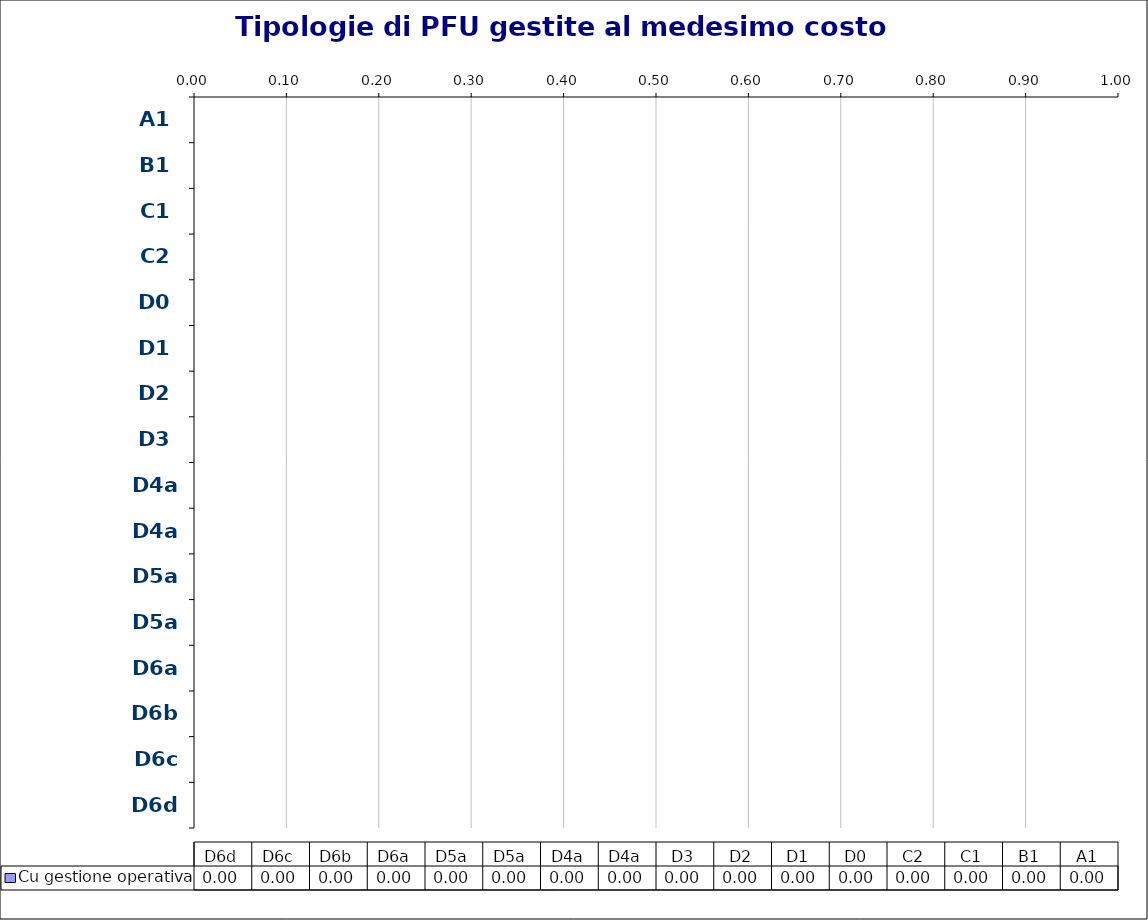
| Category | Cu gestione operativa |
|---|---|
| A1 | 0 |
| B1 | 0 |
| C1 | 0 |
| C2 | 0 |
| D0 | 0 |
| D1 | 0 |
| D2 | 0 |
| D3 | 0 |
| D4a | 0 |
| D4a | 0 |
| D5a | 0 |
| D5a | 0 |
| D6a | 0 |
| D6b | 0 |
| D6c | 0 |
| D6d | 0 |